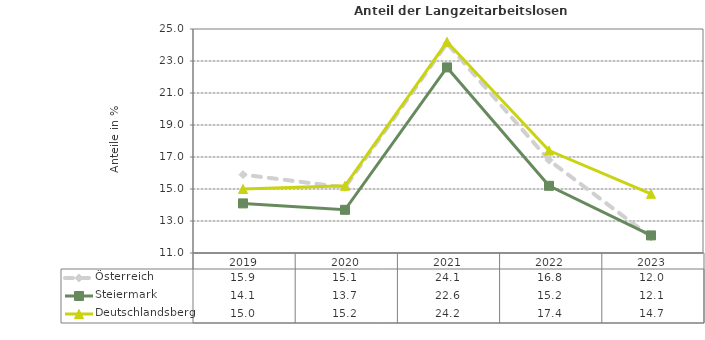
| Category | Österreich | Steiermark | Deutschlandsberg |
|---|---|---|---|
| 2023.0 | 12 | 12.1 | 14.7 |
| 2022.0 | 16.8 | 15.2 | 17.4 |
| 2021.0 | 24.1 | 22.6 | 24.2 |
| 2020.0 | 15.1 | 13.7 | 15.2 |
| 2019.0 | 15.9 | 14.1 | 15 |